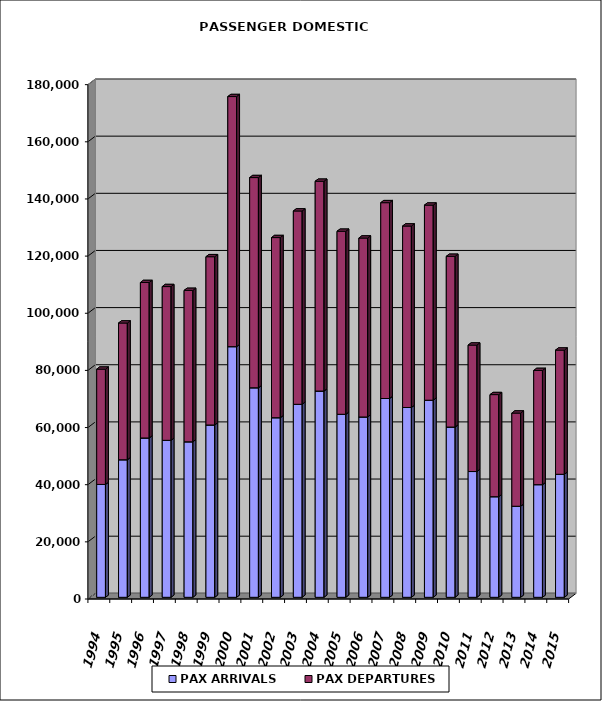
| Category | PAX ARRIVALS | PAX DEPARTURES |
|---|---|---|
| 1994.0 | 39502 | 40342 |
| 1995.0 | 48134 | 47860 |
| 1996.0 | 55761 | 54404 |
| 1997.0 | 54936 | 53809 |
| 1998.0 | 54420 | 52990 |
| 1999.0 | 60310 | 58886 |
| 2000.0 | 87720 | 87520 |
| 2001.0 | 73327 | 73561 |
| 2002.0 | 62851 | 63043 |
| 2003.0 | 67544 | 67662 |
| 2004.0 | 72185 | 73417 |
| 2005.0 | 64049 | 64051 |
| 2006.0 | 63112 | 62619 |
| 2007.0 | 69569 | 68535 |
| 2008.0 | 66425 | 63514 |
| 2009.0 | 68977 | 68276 |
| 2010.0 | 59579 | 59750 |
| 2011.0 | 44016 | 44255 |
| 2012.0 | 35208 | 35729 |
| 2013.0 | 31866 | 32613 |
| 2014.0 | 39424 | 39965 |
| 2015.0 | 43048 | 43467 |